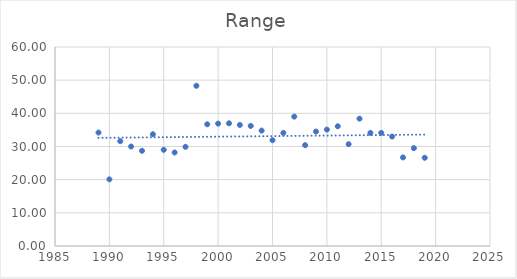
| Category | Range |
|---|---|
| 1989.0 | 34.2 |
| 1990.0 | 20.1 |
| 1991.0 | 31.6 |
| 1992.0 | 30 |
| 1993.0 | 28.7 |
| 1994.0 | 33.7 |
| 1995.0 | 29 |
| 1996.0 | 28.2 |
| 1997.0 | 29.9 |
| 1998.0 | 48.3 |
| 1999.0 | 36.7 |
| 2000.0 | 36.9 |
| 2001.0 | 37 |
| 2002.0 | 36.5 |
| 2003.0 | 36.2 |
| 2004.0 | 34.8 |
| 2005.0 | 31.9 |
| 2006.0 | 34.1 |
| 2007.0 | 39 |
| 2008.0 | 30.4 |
| 2009.0 | 34.5 |
| 2010.0 | 35.1 |
| 2011.0 | 36.1 |
| 2012.0 | 30.7 |
| 2013.0 | 38.4 |
| 2014.0 | 34.1 |
| 2015.0 | 34.1 |
| 2016.0 | 33 |
| 2017.0 | 26.7 |
| 2018.0 | 29.5 |
| 2019.0 | 26.6 |